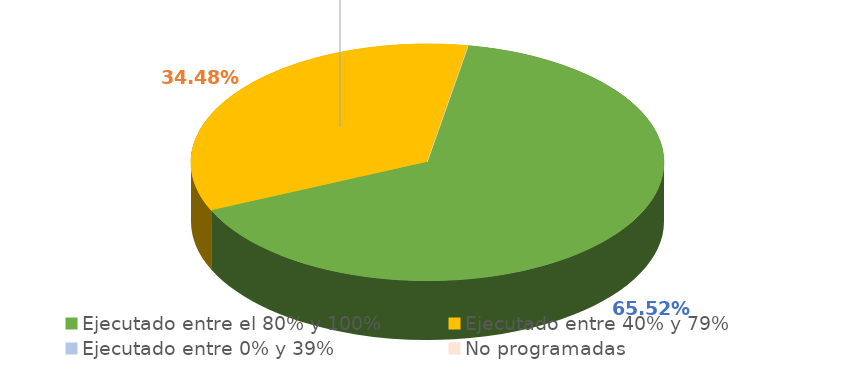
| Category | Series 0 |
|---|---|
| Ejecutado entre el 80% y 100% | 0.655 |
| Ejecutado entre 40% y 79% | 0.345 |
| Ejecutado entre 0% y 39% | 0 |
| No programadas | 0 |